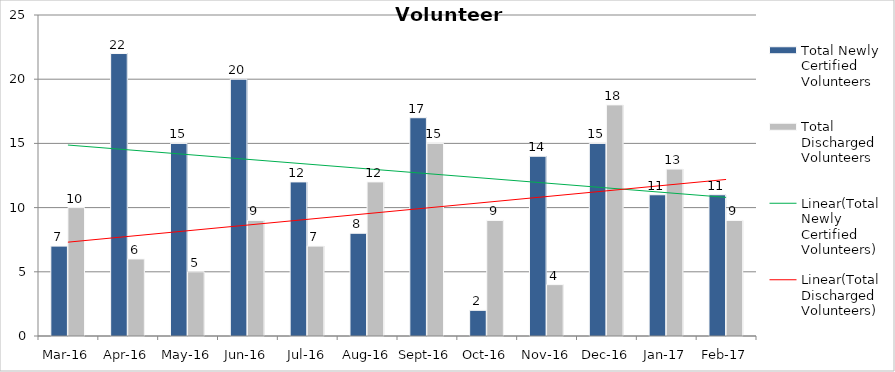
| Category | Total Newly Certified Volunteers | Total Discharged Volunteers |
|---|---|---|
| Mar-16 | 7 | 10 |
| Apr-16 | 22 | 6 |
| May-16 | 15 | 5 |
| Jun-16 | 20 | 9 |
| Jul-16 | 12 | 7 |
| Aug-16 | 8 | 12 |
| Sep-16 | 17 | 15 |
| Oct-16 | 2 | 9 |
| Nov-16 | 14 | 4 |
| Dec-16 | 15 | 18 |
| Jan-17 | 11 | 13 |
| Feb-17 | 11 | 9 |